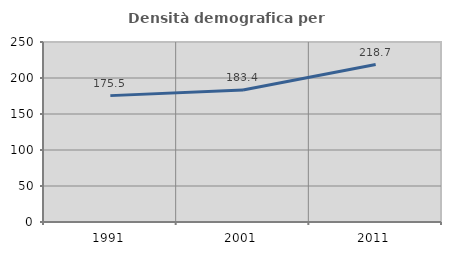
| Category | Densità demografica |
|---|---|
| 1991.0 | 175.522 |
| 2001.0 | 183.367 |
| 2011.0 | 218.654 |